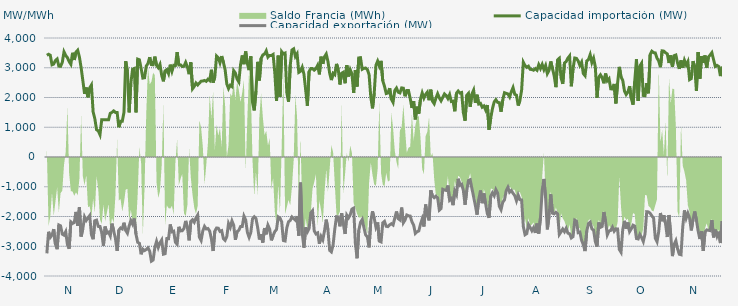
| Category | Capacidad importación (MW) | Capacidad exportación (MW) |
|---|---|---|
| 0 | 3418.208 | -3238.958 |
| 1900-01-01 | 3452.875 | -2513.333 |
| 1900-01-02 | 3420.292 | -2703.208 |
| 1900-01-03 | 3100.083 | -2630.333 |
| 1900-01-04 | 3123.375 | -2422.458 |
| 1900-01-05 | 3242.792 | -2928.833 |
| 1900-01-06 | 3294.958 | -3098.417 |
| 1900-01-07 | 3054.042 | -2285.333 |
| 1900-01-08 | 3047.542 | -2315.25 |
| 1900-01-09 | 3179.458 | -2592.333 |
| 1900-01-10 | 3533.833 | -2627.792 |
| 1900-01-11 | 3414 | -2509.75 |
| 1900-01-12 | 3340.25 | -2944.208 |
| 1900-01-13 | 3208.208 | -3084.875 |
| 1900-01-14 | 3116.333 | -2180.292 |
| 1900-01-15 | 3502.875 | -2231.333 |
| 1900-01-16 | 3262.542 | -2201.667 |
| 1900-01-17 | 3524.167 | -1845.708 |
| 1900-01-18 | 3589.042 | -2314 |
| 1900-01-19 | 3358.375 | -1684.042 |
| 1900-01-20 | 3002 | -2672.375 |
| 1900-01-21 | 2567.583 | -2409.375 |
| 1900-01-22 | 2121 | -2013.417 |
| 1900-01-23 | 2334.5 | -2132.333 |
| 1900-01-24 | 2006.833 | -2047.042 |
| 1900-01-25 | 2325 | -1968.542 |
| 1900-01-26 | 2420.75 | -2611.292 |
| 1900-01-27 | 1517.25 | -2763 |
| 1900-01-28 | 1283.917 | -2141.667 |
| 1900-01-29 | 916.417 | -2120.833 |
| 1900-01-30 | 879.167 | -2332.417 |
| 1900-01-31 | 750 | -2334.958 |
| 1900-02-01 | 1250 | -2536 |
| 1900-02-02 | 1250 | -2982 |
| 1900-02-03 | 1250 | -2338.583 |
| 1900-02-04 | 1250 | -2558.333 |
| 1900-02-05 | 1250 | -2526.375 |
| 1900-02-06 | 1470.833 | -2652.25 |
| 1900-02-07 | 1500 | -2239.292 |
| 1900-02-08 | 1550 | -2486.75 |
| 1900-02-09 | 1500 | -2733.5 |
| 1900-02-10 | 1500 | -3155.125 |
| 1900-02-11 | 1000 | -2458.542 |
| 1900-02-12 | 1200 | -2385.25 |
| 1900-02-13 | 1200 | -2419 |
| 1900-02-14 | 1500 | -2208.75 |
| 1900-02-15 | 3221.708 | -2468.625 |
| 1900-02-16 | 2881.375 | -2561.25 |
| 1900-02-17 | 1500 | -2320.833 |
| 1900-02-18 | 2479.75 | -2136.875 |
| 1900-02-19 | 2947.875 | -2253.917 |
| 1900-02-20 | 2974.833 | -2068.75 |
| 1900-02-21 | 1500 | -2595.083 |
| 1900-02-22 | 3289.208 | -2867.583 |
| 1900-02-23 | 3267.875 | -2898.625 |
| 1900-02-24 | 2979.083 | -3270.083 |
| 1900-02-25 | 2652.375 | -3097.333 |
| 1900-02-26 | 2663.208 | -3144.542 |
| 1900-02-27 | 3058.292 | -3107.917 |
| 1900-02-28 | 3141.958 | -3054.292 |
| 1900-02-28 | 3354.667 | -3163.833 |
| 1900-03-01 | 3106.083 | -3500.875 |
| 1900-03-02 | 3099.042 | -3464.417 |
| 1900-03-03 | 3374.208 | -3046.25 |
| 1900-03-04 | 3081.083 | -2836.417 |
| 1900-03-05 | 3002 | -3040.417 |
| 1900-03-06 | 3113.875 | -2884.417 |
| 1900-03-07 | 2746.792 | -2789.333 |
| 1900-03-08 | 2544 | -3266.167 |
| 1900-03-09 | 2896.458 | -3250.667 |
| 1900-03-10 | 2937 | -2740.375 |
| 1900-03-11 | 2803.458 | -2745 |
| 1900-03-12 | 3104.125 | -2267.833 |
| 1900-03-13 | 2884.333 | -2514.583 |
| 1900-03-14 | 3081.042 | -2493.458 |
| 1900-03-15 | 3079.083 | -2866 |
| 1900-03-16 | 3524.292 | -2932.083 |
| 1900-03-17 | 3096.5 | -2347.083 |
| 1900-03-18 | 3096.5 | -2484.875 |
| 1900-03-19 | 3044.417 | -2478.583 |
| 1900-03-20 | 3048.167 | -2403.5 |
| 1900-03-21 | 3181.083 | -2147.542 |
| 1900-03-22 | 3030.708 | -2365.833 |
| 1900-03-23 | 2784.5 | -2801.333 |
| 1900-03-24 | 3182.417 | -2165.083 |
| 1900-03-25 | 2292.583 | -2110.5 |
| 1900-03-26 | 2370.25 | -2192.75 |
| 1900-03-27 | 2487.208 | -2051.417 |
| 1900-03-28 | 2421.292 | -1952.083 |
| 1900-03-29 | 2482.917 | -2699.375 |
| 1900-03-30 | 2548.458 | -2805.375 |
| 1900-03-31 | 2554.458 | -2484.042 |
| 1900-04-01 | 2574.083 | -2331.417 |
| 1900-04-02 | 2544.458 | -2417.833 |
| 1900-04-03 | 2615.833 | -2403.25 |
| 1900-04-04 | 2568.917 | -2488.625 |
| 1900-04-05 | 2932.208 | -2748.875 |
| 1900-04-06 | 2500.875 | -3160.125 |
| 1900-04-07 | 2689.458 | -2491.667 |
| 1900-04-08 | 3392.292 | -2386.5 |
| 1900-04-09 | 3335.083 | -2392.75 |
| 1900-04-10 | 3167.5 | -2500.5 |
| 1900-04-11 | 3390.625 | -2475.917 |
| 1900-04-12 | 3180.958 | -2741.75 |
| 1900-04-13 | 2936.5 | -2801.625 |
| 1900-04-14 | 2452.792 | -2674.667 |
| 1900-04-15 | 2300.208 | -2235.25 |
| 1900-04-16 | 2411.792 | -2365.167 |
| 1900-04-17 | 2366.75 | -2147.917 |
| 1900-04-18 | 2902.042 | -2292.875 |
| 1900-04-19 | 2822.25 | -2784.375 |
| 1900-04-20 | 2619.333 | -2505.792 |
| 1900-04-21 | 2523.292 | -2462.542 |
| 1900-04-22 | 3101.75 | -2337.5 |
| 1900-04-23 | 3414.042 | -2335.5 |
| 1900-04-24 | 3119.417 | -1987.458 |
| 1900-04-25 | 3547.333 | -2114.583 |
| 1900-04-26 | 3135.708 | -2530.042 |
| 1900-04-27 | 2921.125 | -2699.333 |
| 1900-04-28 | 3380.917 | -2535.75 |
| 1900-04-29 | 1842.042 | -2078.542 |
| 1900-04-30 | 1566.833 | -2010.417 |
| 1900-05-01 | 2214.542 | -2066.667 |
| 1900-05-02 | 3198.583 | -2370 |
| 1900-05-03 | 2574 | -2772.958 |
| 1900-05-04 | 3310.583 | -2592.083 |
| 1900-05-05 | 3430.75 | -2875.542 |
| 1900-05-06 | 3458.333 | -2387.75 |
| 1900-05-07 | 3568.125 | -2599.208 |
| 1900-05-08 | 3355.708 | -2294.333 |
| 1900-05-09 | 3414.333 | -2427 |
| 1900-05-10 | 3410.542 | -2802.125 |
| 1900-05-11 | 3447.375 | -2640.958 |
| 1900-05-12 | 2831.208 | -2506.667 |
| 1900-05-13 | 1881.583 | -2434.25 |
| 1900-05-14 | 3406.708 | -2011.583 |
| 1900-05-15 | 2022.5 | -2050 |
| 1900-05-16 | 3540.875 | -2176.417 |
| 1900-05-17 | 3466.542 | -2807.167 |
| 1900-05-18 | 3493.375 | -2823.167 |
| 1900-05-19 | 2166.833 | -2382.125 |
| 1900-05-20 | 1859.958 | -2177.167 |
| 1900-05-21 | 3077.875 | -2132.833 |
| 1900-05-22 | 3595.75 | -2015.417 |
| 1900-05-23 | 3634.375 | -2069.417 |
| 1900-05-24 | 3379.833 | -2125 |
| 1900-05-25 | 3470.304 | -1991.957 |
| 1900-05-26 | 2844 | -2641.708 |
| 1900-05-27 | 2880.625 | -862.5 |
| 1900-05-28 | 3017.208 | -2558.208 |
| 1900-05-29 | 2787.708 | -3047.042 |
| 1900-05-30 | 2256.625 | -2365.667 |
| 1900-05-31 | 1722.917 | -2515.917 |
| 1900-06-01 | 2869 | -2405.667 |
| 1900-06-02 | 2973.167 | -1879.167 |
| 1900-06-03 | 2971 | -1806.25 |
| 1900-06-04 | 2919.208 | -2484.833 |
| 1900-06-05 | 2973.125 | -2583.917 |
| 1900-06-06 | 3083.25 | -2551.375 |
| 1900-06-07 | 2777.875 | -2917.292 |
| 1900-06-08 | 3371.833 | -2672.292 |
| 1900-06-09 | 3131 | -2785.25 |
| 1900-06-10 | 3368.375 | -2480.958 |
| 1900-06-11 | 3462.292 | -2105.333 |
| 1900-06-12 | 3215.917 | -2442.958 |
| 1900-06-13 | 2817.875 | -3136.917 |
| 1900-06-14 | 2586 | -3188.792 |
| 1900-06-15 | 2815 | -2954.042 |
| 1900-06-16 | 2767 | -2418.75 |
| 1900-06-17 | 3129.208 | -2005 |
| 1900-06-18 | 2953.792 | -2013.417 |
| 1900-06-19 | 2437.083 | -2329.833 |
| 1900-06-20 | 2815.958 | -1889.333 |
| 1900-06-21 | 2849.708 | -2257.667 |
| 1900-06-22 | 2479.208 | -2586.833 |
| 1900-06-23 | 3084.333 | -1954.5 |
| 1900-06-24 | 2707.042 | -2046.583 |
| 1900-06-25 | 2933.542 | -1941.667 |
| 1900-06-26 | 2795.917 | -1750 |
| 1900-06-27 | 2158.042 | -1718.75 |
| 1900-06-28 | 2918.875 | -2898.083 |
| 1900-06-29 | 2368.375 | -3404.167 |
| 1900-06-30 | 3329.75 | -2465.083 |
| 1900-07-01 | 3339.208 | -2197.25 |
| 1900-07-02 | 2948.5 | -2100.583 |
| 1900-07-03 | 2980.792 | -2371.042 |
| 1900-07-04 | 2990.708 | -2620.708 |
| 1900-07-05 | 2938.333 | -2683 |
| 1900-07-06 | 2774.542 | -3036.75 |
| 1900-07-07 | 2014.917 | -2156.292 |
| 1900-07-08 | 1635.417 | -1825.292 |
| 1900-07-09 | 2140.25 | -2060.75 |
| 1900-07-10 | 3080.917 | -2353.125 |
| 1900-07-11 | 3223.333 | -2199.083 |
| 1900-07-12 | 3058.083 | -2827.667 |
| 1900-07-13 | 3231.167 | -2853.292 |
| 1900-07-14 | 2562 | -2213.625 |
| 1900-07-15 | 2375 | -2164.25 |
| 1900-07-16 | 2133.333 | -2329.5 |
| 1900-07-17 | 2150 | -2341.083 |
| 1900-07-18 | 2314.583 | -2282 |
| 1900-07-19 | 1943.75 | -2242.25 |
| 1900-07-20 | 1835.625 | -2285.208 |
| 1900-07-21 | 2235.417 | -2055.542 |
| 1900-07-22 | 2316.667 | -1831.25 |
| 1900-07-23 | 2178.125 | -2071.583 |
| 1900-07-24 | 2154.167 | -2116.125 |
| 1900-07-25 | 2321.417 | -1699.458 |
| 1900-07-26 | 2312 | -2210.167 |
| 1900-07-27 | 2040.917 | -2118.083 |
| 1900-07-28 | 2233.083 | -1949.458 |
| 1900-07-29 | 2234.854 | -1977.083 |
| 1900-07-30 | 1964.583 | -1985.792 |
| 1900-07-31 | 1650 | -2177.417 |
| 1900-08-01 | 1877.083 | -2287.667 |
| 1900-08-02 | 1264.583 | -2568.708 |
| 1900-08-03 | 1691.667 | -2512.667 |
| 1900-08-04 | 1456.25 | -2486.333 |
| 1900-08-05 | 1945.833 | -2259.083 |
| 1900-08-06 | 2154.167 | -2079.5 |
| 1900-08-07 | 1979.167 | -2336.083 |
| 1900-08-08 | 2104.167 | -1597.917 |
| 1900-08-09 | 2179.167 | -1954.167 |
| 1900-08-10 | 1908.333 | -2131.25 |
| 1900-08-11 | 2262.5 | -1118.75 |
| 1900-08-12 | 1879.167 | -1314.583 |
| 1900-08-13 | 1791.667 | -1368 |
| 1900-08-14 | 1977.083 | -1316.667 |
| 1900-08-15 | 2127.083 | -1377.083 |
| 1900-08-16 | 1987.5 | -1785.417 |
| 1900-08-17 | 1887.5 | -1733.333 |
| 1900-08-18 | 2002.083 | -1085.417 |
| 1900-08-19 | 2118.75 | -1110.417 |
| 1900-08-20 | 2066.667 | -1125 |
| 1900-08-21 | 1966.667 | -958.333 |
| 1900-08-22 | 2097.917 | -1454.167 |
| 1900-08-23 | 1864.583 | -1397.917 |
| 1900-08-24 | 1877.083 | -1618.75 |
| 1900-08-25 | 1537.5 | -1143.75 |
| 1900-08-26 | 2145.833 | -1264 |
| 1900-08-27 | 2216.667 | -731.25 |
| 1900-08-28 | 2150 | -950 |
| 1900-08-29 | 2167.583 | -916.667 |
| 1900-08-30 | 1493.75 | -1122.25 |
| 1900-08-31 | 1220.833 | -1604.167 |
| 1900-09-01 | 2072.917 | -1125 |
| 1900-09-02 | 2139.583 | -791.667 |
| 1900-09-03 | 1687.5 | -764.583 |
| 1900-09-04 | 2116.667 | -1058.333 |
| 1900-09-05 | 2247.917 | -1337.5 |
| 1900-09-06 | 1818.75 | -1627.083 |
| 1900-09-07 | 2093.75 | -1937.5 |
| 1900-09-08 | 1781.25 | -1422.917 |
| 1900-09-09 | 1804.167 | -1127.083 |
| 1900-09-10 | 1675 | -1552.083 |
| 1900-09-11 | 1716.667 | -1225 |
| 1900-09-12 | 1583.333 | -1570.833 |
| 1900-09-13 | 1747.917 | -1904.167 |
| 1900-09-14 | 918.75 | -2042.875 |
| 1900-09-15 | 1314.583 | -1310.417 |
| 1900-09-16 | 1629.167 | -1200 |
| 1900-09-17 | 1852.083 | -1300.583 |
| 1900-09-18 | 1925 | -1095.833 |
| 1900-09-19 | 1835.417 | -1208.333 |
| 1900-09-20 | 1827.083 | -1656.25 |
| 1900-09-21 | 1522.917 | -1770.917 |
| 1900-09-22 | 1916.667 | -1518.75 |
| 1900-09-23 | 2160.417 | -1441.667 |
| 1900-09-24 | 2139.583 | -1137.5 |
| 1900-09-25 | 2120.833 | -1018.75 |
| 1900-09-26 | 2018.75 | -1183.333 |
| 1900-09-27 | 2193.75 | -1127.083 |
| 1900-09-28 | 2333.333 | -1220.833 |
| 1900-09-29 | 2108.333 | -1295.833 |
| 1900-09-30 | 2079.833 | -1472.917 |
| 1900-10-01 | 1729.167 | -1281.25 |
| 1900-10-02 | 1897.917 | -1434.542 |
| 1900-10-03 | 2247 | -1443.75 |
| 1900-10-04 | 3185.083 | -2337 |
| 1900-10-05 | 3075.167 | -2613.625 |
| 1900-10-06 | 3013.625 | -2576.5 |
| 1900-10-07 | 3052.042 | -2269.25 |
| 1900-10-08 | 2946.333 | -2370.833 |
| 1900-10-09 | 2940.542 | -2478.958 |
| 1900-10-10 | 2917.208 | -2375.625 |
| 1900-10-11 | 2971.167 | -2551.875 |
| 1900-10-12 | 2917.292 | -2238 |
| 1900-10-13 | 3101.958 | -2573.167 |
| 1900-10-14 | 2973.375 | -2041.667 |
| 1900-10-15 | 3109.875 | -1120.167 |
| 1900-10-16 | 2936.333 | -737.5 |
| 1900-10-17 | 3074.833 | -1371.667 |
| 1900-10-18 | 2802.417 | -2434.917 |
| 1900-10-19 | 2913.625 | -1996.875 |
| 1900-10-20 | 3212.125 | -1254.167 |
| 1900-10-21 | 2973 | -1887.5 |
| 1900-10-22 | 2732 | -1910.417 |
| 1900-10-23 | 2348.333 | -1858 |
| 1900-10-24 | 3266 | -1911.25 |
| 1900-10-25 | 3318.417 | -2603.917 |
| 1900-10-26 | 2666.292 | -2519.292 |
| 1900-10-27 | 2457.667 | -2420.375 |
| 1900-10-28 | 3159.917 | -2510.583 |
| 1900-10-29 | 3208.208 | -2395.833 |
| 1900-10-30 | 3322.042 | -2559.25 |
| 1900-10-31 | 3397.292 | -2579.208 |
| 1900-11-01 | 2377.292 | -2722 |
| 1900-11-02 | 2966.875 | -2678.583 |
| 1900-11-03 | 3327.583 | -2120.833 |
| 1900-11-04 | 3314.125 | -2154.167 |
| 1900-11-05 | 3229.625 | -2542.417 |
| 1900-11-06 | 3075.125 | -2524.125 |
| 1900-11-07 | 3186.833 | -2800.875 |
| 1900-11-08 | 2804.417 | -2944.208 |
| 1900-11-09 | 2733.75 | -3162.5 |
| 1900-11-10 | 3225.458 | -2491.042 |
| 1900-11-11 | 3275.667 | -2238.417 |
| 1900-11-12 | 3439.5 | -2190.417 |
| 1900-11-13 | 3175.292 | -2417.375 |
| 1900-11-14 | 3321.875 | -2458.417 |
| 1900-11-15 | 3034.917 | -2846.167 |
| 1900-11-16 | 1991.917 | -3010.667 |
| 1900-11-17 | 2685.833 | -2200.25 |
| 1900-11-18 | 2763.167 | -2365.208 |
| 1900-11-19 | 2664.875 | -2334.375 |
| 1900-11-20 | 2477.792 | -1849.417 |
| 1900-11-21 | 2804.25 | -2175.083 |
| 1900-11-22 | 2563.458 | -2614.833 |
| 1900-11-23 | 2629.917 | -2484.333 |
| 1900-11-24 | 2292 | -2469.792 |
| 1900-11-25 | 2284.542 | -2356.917 |
| 1900-11-26 | 2456.5 | -2494.792 |
| 1900-11-27 | 1801.792 | -2413.833 |
| 1900-11-28 | 2484.917 | -2419 |
| 1900-11-29 | 3029.417 | -3108.292 |
| 1900-11-30 | 2693.417 | -3201.125 |
| 1900-12-01 | 2579.5 | -2439 |
| 1900-12-02 | 2220.833 | -2146.167 |
| 1900-12-03 | 2100 | -2410.292 |
| 1900-12-04 | 2179.167 | -2202.083 |
| 1900-12-05 | 2381.25 | -2508.5 |
| 1900-12-06 | 1970.833 | -2414.375 |
| 1900-12-07 | 1758.333 | -2292.792 |
| 1900-12-08 | 2544 | -2324.083 |
| 1900-12-09 | 3285.125 | -2739.75 |
| 1900-12-10 | 1885.375 | -2754.917 |
| 1900-12-11 | 3057.958 | -2601 |
| 1900-12-12 | 3152.583 | -2708.375 |
| 1900-12-13 | 2068.833 | -2840.833 |
| 1900-12-14 | 2060.917 | -2586.417 |
| 1900-12-15 | 2484.25 | -1839.417 |
| 1900-12-16 | 2141.208 | -1845.833 |
| 1900-12-17 | 3445.375 | -1893.75 |
| 1900-12-18 | 3555.25 | -1979.583 |
| 1900-12-19 | 3506.875 | -2054.167 |
| 1900-12-20 | 3499.292 | -2730 |
| 1900-12-21 | 3321.917 | -2848.375 |
| 1900-12-22 | 3225.583 | -2505.583 |
| 1900-12-23 | 3019.583 | -1882.958 |
| 1900-12-24 | 3568.667 | -2157.833 |
| 1900-12-25 | 3559.375 | -1957.75 |
| 1900-12-26 | 3503.125 | -2252.375 |
| 1900-12-27 | 3464.458 | -2689.458 |
| 1900-12-28 | 3159.52 | -1949.52 |
| 1900-12-29 | 3414.875 | -2624.75 |
| 1900-12-30 | 3028.417 | -3331.875 |
| 1900-12-31 | 3406.833 | -2936.5 |
| 1901-01-01 | 3428.875 | -2811.25 |
| 1901-01-02 | 3154.208 | -3088.625 |
| 1901-01-03 | 2961.542 | -3268.083 |
| 1901-01-04 | 3246.75 | -3285.125 |
| 1901-01-05 | 2998.792 | -2359.333 |
| 1901-01-06 | 3250.625 | -1795.833 |
| 1901-01-07 | 3098.083 | -2058.458 |
| 1901-01-08 | 3208.458 | -1889.583 |
| 1901-01-09 | 2600.833 | -2050 |
| 1901-01-10 | 2636.458 | -2468.208 |
| 1901-01-11 | 3221.75 | -2100 |
| 1901-01-12 | 3030.917 | -1831.25 |
| 1901-01-13 | 2221.417 | -2127.083 |
| 1901-01-14 | 3529.833 | -2490.5 |
| 1901-01-15 | 2631.583 | -2756.25 |
| 1901-01-16 | 3389.417 | -2493.667 |
| 1901-01-17 | 3161.917 | -3158.375 |
| 1901-01-18 | 3412.417 | -2518.792 |
| 1901-01-19 | 3004.917 | -2450.333 |
| 1901-01-20 | 3360.75 | -2463.25 |
| 1901-01-21 | 3427.958 | -2474.292 |
| 1901-01-22 | 3506.917 | -2123.5 |
| 1901-01-23 | 3269.708 | -2701.708 |
| 1901-01-24 | 3043.333 | -2440.417 |
| 1901-01-25 | 3078.833 | -2660.667 |
| 1901-01-26 | 3042.542 | -2510.25 |
| 1901-01-27 | 2720.083 | -2892.208 |
| 1901-01-28 | 3035.792 | -2156.833 |